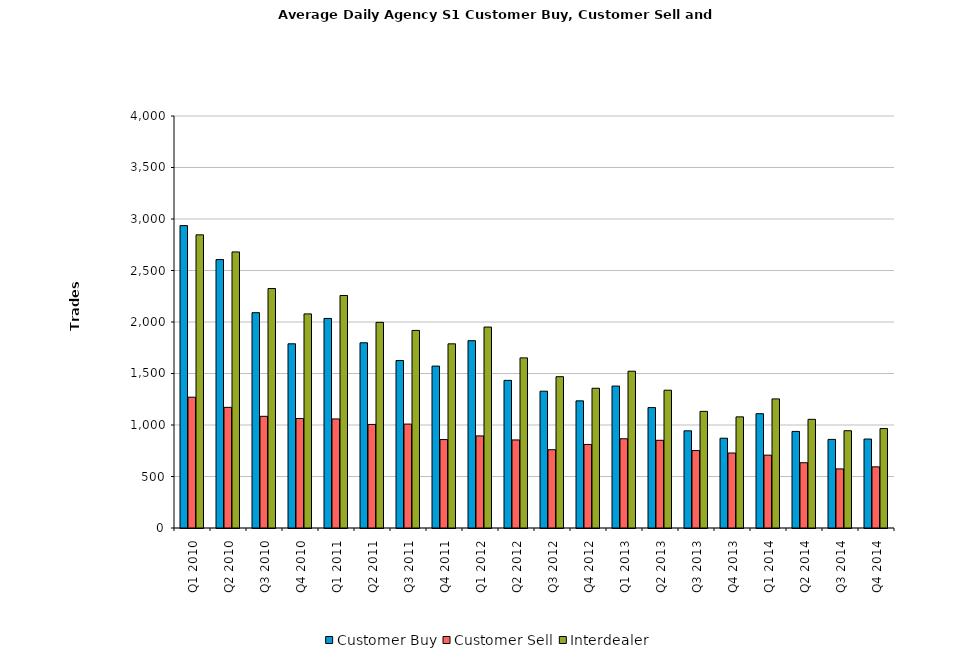
| Category | Customer Buy | Customer Sell | Interdealer |
|---|---|---|---|
| Q1 2010 | 2935.739 | 1270 | 2845.957 |
| Q2 2010 | 2606.111 | 1171.286 | 2680.349 |
| Q3 2010 | 2090.5 | 1084.203 | 2324.938 |
| Q4 2010 | 1788.234 | 1062.766 | 2078.609 |
| Q1 2011 | 2034.387 | 1058.839 | 2257.29 |
| Q2 2011 | 1798.238 | 1005.46 | 1996.54 |
| Q3 2011 | 1625.875 | 1008.922 | 1918.328 |
| Q4 2011 | 1571.873 | 858.524 | 1788.048 |
| Q1 2012 | 1818.403 | 893.984 | 1950.984 |
| Q2 2012 | 1433.317 | 854.921 | 1651.683 |
| Q3 2012 | 1328.175 | 759.905 | 1468.937 |
| Q4 2012 | 1234.317 | 811.079 | 1356.746 |
| Q1 2013 | 1378.153 | 866.39 | 1522.169 |
| Q2 2013 | 1169.125 | 851.344 | 1337.641 |
| Q3 2013 | 943.422 | 751.781 | 1132.391 |
| Q4 2013 | 871.625 | 728.125 | 1079 |
| Q1 2014 | 1109.705 | 707.328 | 1253.279 |
| Q2 2014 | 937.619 | 633.714 | 1054.984 |
| Q3 2014 | 860.031 | 573.609 | 944.453 |
| Q4 2014 | 863.531 | 593.469 | 965.375 |